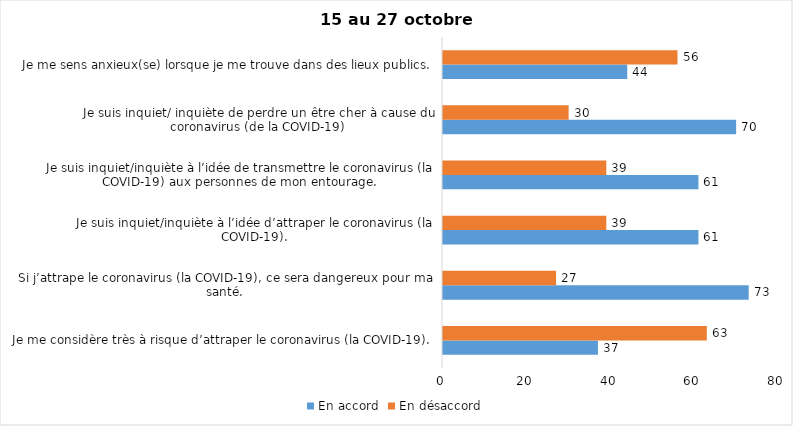
| Category | En accord | En désaccord |
|---|---|---|
| Je me considère très à risque d’attraper le coronavirus (la COVID-19). | 37 | 63 |
| Si j’attrape le coronavirus (la COVID-19), ce sera dangereux pour ma santé. | 73 | 27 |
| Je suis inquiet/inquiète à l’idée d’attraper le coronavirus (la COVID-19). | 61 | 39 |
| Je suis inquiet/inquiète à l’idée de transmettre le coronavirus (la COVID-19) aux personnes de mon entourage. | 61 | 39 |
| Je suis inquiet/ inquiète de perdre un être cher à cause du coronavirus (de la COVID-19) | 70 | 30 |
| Je me sens anxieux(se) lorsque je me trouve dans des lieux publics. | 44 | 56 |